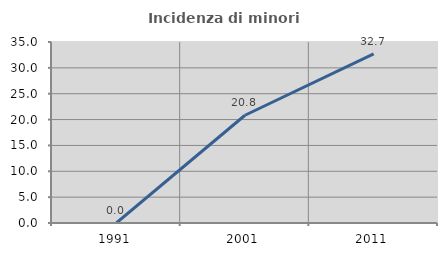
| Category | Incidenza di minori stranieri |
|---|---|
| 1991.0 | 0 |
| 2001.0 | 20.833 |
| 2011.0 | 32.692 |